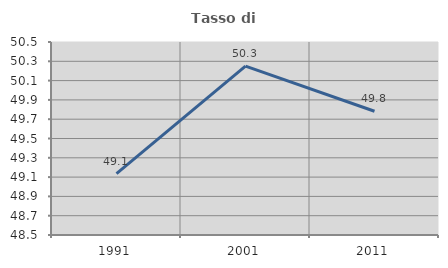
| Category | Tasso di occupazione   |
|---|---|
| 1991.0 | 49.135 |
| 2001.0 | 50.251 |
| 2011.0 | 49.782 |